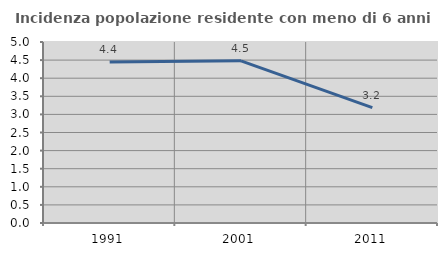
| Category | Incidenza popolazione residente con meno di 6 anni |
|---|---|
| 1991.0 | 4.444 |
| 2001.0 | 4.479 |
| 2011.0 | 3.188 |